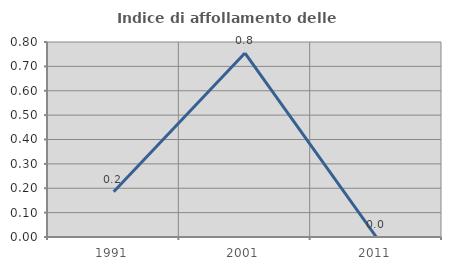
| Category | Indice di affollamento delle abitazioni  |
|---|---|
| 1991.0 | 0.186 |
| 2001.0 | 0.755 |
| 2011.0 | 0 |